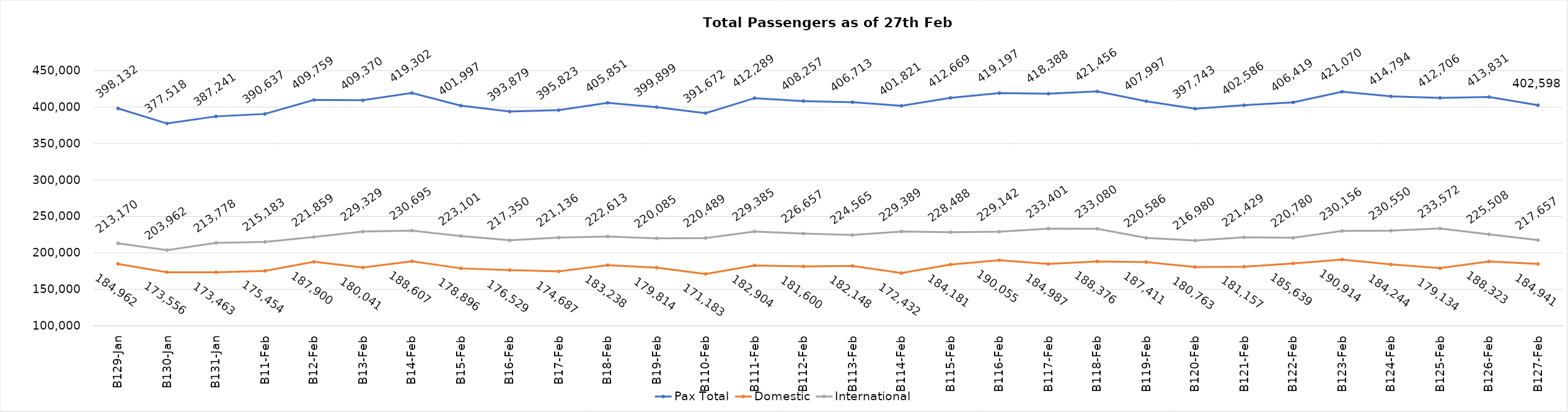
| Category | Pax Total | Domestic | International |
|---|---|---|---|
| 2024-01-29 | 398132 | 184962 | 213170 |
| 2024-01-30 | 377518 | 173556 | 203962 |
| 2024-01-31 | 387241 | 173463 | 213778 |
| 2024-02-01 | 390637 | 175454 | 215183 |
| 2024-02-02 | 409759 | 187900 | 221859 |
| 2024-02-03 | 409370 | 180041 | 229329 |
| 2024-02-04 | 419302 | 188607 | 230695 |
| 2024-02-05 | 401997 | 178896 | 223101 |
| 2024-02-06 | 393879 | 176529 | 217350 |
| 2024-02-07 | 395823 | 174687 | 221136 |
| 2024-02-08 | 405851 | 183238 | 222613 |
| 2024-02-09 | 399899 | 179814 | 220085 |
| 2024-02-10 | 391672 | 171183 | 220489 |
| 2024-02-11 | 412289 | 182904 | 229385 |
| 2024-02-12 | 408257 | 181600 | 226657 |
| 2024-02-13 | 406713 | 182148 | 224565 |
| 2024-02-14 | 401821 | 172432 | 229389 |
| 2024-02-15 | 412669 | 184181 | 228488 |
| 2024-02-16 | 419197 | 190055 | 229142 |
| 2024-02-17 | 418388 | 184987 | 233401 |
| 2024-02-18 | 421456 | 188376 | 233080 |
| 2024-02-19 | 407997 | 187411 | 220586 |
| 2024-02-20 | 397743 | 180763 | 216980 |
| 2024-02-21 | 402586 | 181157 | 221429 |
| 2024-02-22 | 406419 | 185639 | 220780 |
| 2024-02-23 | 421070 | 190914 | 230156 |
| 2024-02-24 | 414794 | 184244 | 230550 |
| 2024-02-25 | 412706 | 179134 | 233572 |
| 2024-02-26 | 413831 | 188323 | 225508 |
| 2024-02-27 | 402598 | 184941 | 217657 |